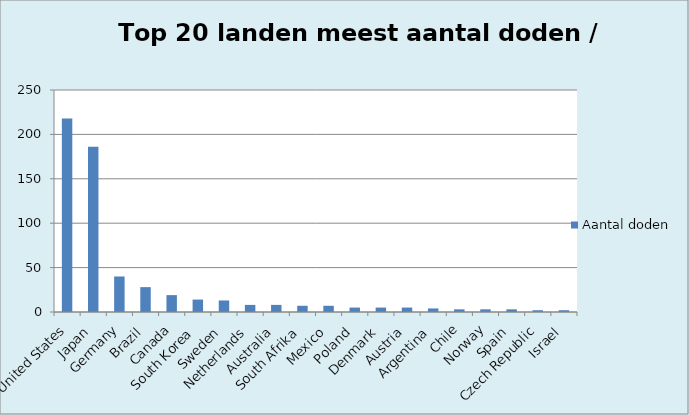
| Category | Aantal doden |
|---|---|
| United States | 218 |
| Japan | 186 |
| Germany | 40 |
| Brazil | 28 |
| Canada | 19 |
| South Korea | 14 |
| Sweden | 13 |
| Netherlands | 8 |
| Australia | 8 |
| South Afrika | 7 |
| Mexico | 7 |
| Poland | 5 |
| Denmark | 5 |
| Austria | 5 |
| Argentina | 4 |
| Chile | 3 |
| Norway | 3 |
| Spain | 3 |
| Czech Republic | 2 |
| Israel | 2 |